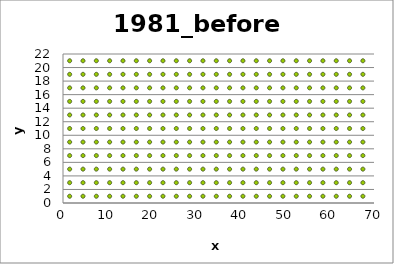
| Category | Series 0 |
|---|---|
| 4.5 | 1 |
| 13.5 | 1 |
| 43.5 | 1 |
| 4.5 | 3 |
| 1.5 | 5 |
| 4.5 | 5 |
| 22.5 | 5 |
| 31.5 | 5 |
| 37.5 | 7 |
| 16.5 | 7 |
| 1.5 | 9 |
| 10.5 | 9 |
| 34.5 | 11 |
| 13.5 | 11 |
| 13.5 | 13 |
| 40.5 | 13 |
| 46.5 | 15 |
| 19.5 | 15 |
| 16.5 | 17 |
| 25.5 | 19 |
| 4.5 | 21 |
| 40.5 | 21 |
| 52.5 | 5 |
| 22.5 | 7 |
| 1.5 | 15 |
| 19.5 | 1 |
| 25.5 | 3 |
| 31.5 | 15 |
| 4.5 | 9 |
| 10.5 | 17 |
| 61.5 | 3 |
| 37.5 | 3 |
| 13.5 | 17 |
| 67.5 | 7 |
| 28.5 | 1 |
| 7.5 | 15 |
| 22.5 | 15 |
| 16.5 | 5 |
| 67.5 | 17 |
| 43.5 | 7 |
| 70.5 | 11 |
| 7.5 | 11 |
| 1.5 | 13 |
| 16.5 | 13 |
| 16.5 | 15 |
| 61.5 | 21 |
| 49.5 | 3 |
| 34.5 | 3 |
| 37.5 | 5 |
| 67.5 | 13 |
| 22.5 | 11 |
| 31.5 | 3 |
| 64.5 | 17 |
| 34.5 | 19 |
| 31.5 | 21 |
| 43.5 | 19 |
| 49.5 | 15 |
| 13.5 | 5 |
| 58.5 | 5 |
| 13.5 | 3 |
| 10.5 | 3 |
| 70.5 | 19 |
| 61.5 | 19 |
| 49.5 | 11 |
| 61.5 | 9 |
| 19.5 | 13 |
| 55.5 | 1 |
| 22.5 | 1 |
| 28.5 | 7 |
| 64.5 | 11 |
| 37.5 | 17 |
| 49.5 | 17 |
| 43.5 | 5 |
| 10.5 | 13 |
| 34.5 | 13 |
| 10.5 | 19 |
| 10.5 | 5 |
| 34.5 | 7 |
| 4.5 | 15 |
| 1.5 | 17 |
| 10.5 | 7 |
| 64.5 | 5 |
| 7.5 | 5 |
| 31.5 | 19 |
| 64.5 | 3 |
| 25.5 | 7 |
| 46.5 | 5 |
| 67.5 | 5 |
| 25.5 | 9 |
| 43.5 | 13 |
| 58.5 | 21 |
| 49.5 | 19 |
| 16.5 | 9 |
| 49.5 | 5 |
| 70.5 | 21 |
| 61.5 | 5 |
| 52.5 | 7 |
| 25.5 | 1 |
| 34.5 | 17 |
| 4.5 | 7 |
| 70.5 | 9 |
| 1.5 | 11 |
| 67.5 | 3 |
| 64.5 | 1 |
| 58.5 | 15 |
| 28.5 | 17 |
| 22.5 | 3 |
| 28.5 | 9 |
| 40.5 | 15 |
| 67.5 | 19 |
| 34.5 | 5 |
| 52.5 | 1 |
| 13.5 | 7 |
| 46.5 | 3 |
| 28.5 | 11 |
| 19.5 | 5 |
| 58.5 | 13 |
| 52.5 | 15 |
| 70.5 | 3 |
| 52.5 | 11 |
| 13.5 | 21 |
| 40.5 | 11 |
| 31.5 | 1 |
| 22.5 | 9 |
| 43.5 | 9 |
| 31.5 | 13 |
| 7.5 | 3 |
| 61.5 | 13 |
| 49.5 | 1 |
| 7.5 | 7 |
| 40.5 | 3 |
| 28.5 | 5 |
| 19.5 | 19 |
| 52.5 | 13 |
| 28.5 | 21 |
| 31.5 | 9 |
| 28.5 | 13 |
| 43.5 | 15 |
| 64.5 | 19 |
| 31.5 | 7 |
| 64.5 | 21 |
| 28.5 | 3 |
| 55.5 | 7 |
| 13.5 | 9 |
| 46.5 | 1 |
| 55.5 | 3 |
| 10.5 | 11 |
| 55.5 | 5 |
| 46.5 | 21 |
| 58.5 | 9 |
| 43.5 | 3 |
| 19.5 | 7 |
| 49.5 | 9 |
| 16.5 | 11 |
| 64.5 | 13 |
| 7.5 | 19 |
| 55.5 | 21 |
| 52.5 | 9 |
| 55.5 | 11 |
| 1.5 | 7 |
| 31.5 | 11 |
| 4.5 | 11 |
| 52.5 | 3 |
| 46.5 | 9 |
| 46.5 | 13 |
| 25.5 | 17 |
| 7.5 | 13 |
| 43.5 | 17 |
| 1.5 | 21 |
| 34.5 | 1 |
| 40.5 | 5 |
| 40.5 | 7 |
| 25.5 | 13 |
| 46.5 | 7 |
| 61.5 | 7 |
| 19.5 | 9 |
| 34.5 | 9 |
| 37.5 | 9 |
| 22.5 | 13 |
| 61.5 | 1 |
| 1.5 | 19 |
| 16.5 | 1 |
| 10.5 | 15 |
| 52.5 | 19 |
| 58.5 | 3 |
| 37.5 | 11 |
| 55.5 | 13 |
| 64.5 | 7 |
| 25.5 | 5 |
| 16.5 | 19 |
| 7.5 | 21 |
| 70.5 | 5 |
| 49.5 | 7 |
| 34.5 | 15 |
| 58.5 | 11 |
| 37.5 | 13 |
| 43.5 | 11 |
| 22.5 | 21 |
| 19.5 | 3 |
| 58.5 | 7 |
| 19.5 | 11 |
| 64.5 | 15 |
| 1.5 | 1 |
| 25.5 | 11 |
| 25.5 | 15 |
| 25.5 | 21 |
| 58.5 | 1 |
| 55.5 | 9 |
| 7.5 | 9 |
| 49.5 | 13 |
| 16.5 | 3 |
| 1.5 | 3 |
| 22.5 | 17 |
| 49.5 | 21 |
| 7.5 | 1 |
| 4.5 | 13 |
| 19.5 | 17 |
| 70.5 | 7 |
| 61.5 | 15 |
| 43.5 | 21 |
| 70.5 | 1 |
| 40.5 | 9 |
| 37.5 | 1 |
| 55.5 | 15 |
| 13.5 | 19 |
| 67.5 | 9 |
| 37.5 | 15 |
| 4.5 | 19 |
| 19.5 | 21 |
| 40.5 | 1 |
| 67.5 | 1 |
| 70.5 | 17 |
| 55.5 | 19 |
| 40.5 | 19 |
| 64.5 | 9 |
| 10.5 | 1 |
| 67.5 | 11 |
| 13.5 | 15 |
| 70.5 | 15 |
| 58.5 | 19 |
| 46.5 | 19 |
| 46.5 | 17 |
| 61.5 | 17 |
| 34.5 | 21 |
| 4.5 | 17 |
| 22.5 | 19 |
| 10.5 | 21 |
| 37.5 | 21 |
| 61.5 | 11 |
| 28.5 | 15 |
| 46.5 | 11 |
| 55.5 | 17 |
| 37.5 | 19 |
| 67.5 | 15 |
| 28.5 | 19 |
| 31.5 | 17 |
| 52.5 | 17 |
| 52.5 | 21 |
| 70.5 | 13 |
| 16.5 | 21 |
| 67.5 | 21 |
| 58.5 | 17 |
| 7.5 | 17 |
| 40.5 | 17 |